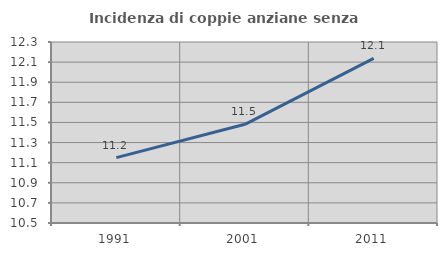
| Category | Incidenza di coppie anziane senza figli  |
|---|---|
| 1991.0 | 11.15 |
| 2001.0 | 11.482 |
| 2011.0 | 12.137 |